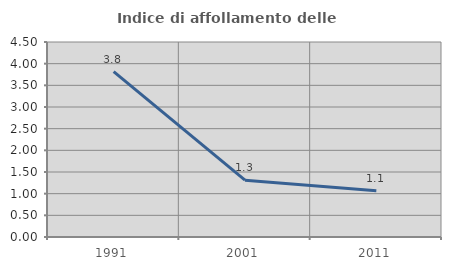
| Category | Indice di affollamento delle abitazioni  |
|---|---|
| 1991.0 | 3.817 |
| 2001.0 | 1.312 |
| 2011.0 | 1.066 |